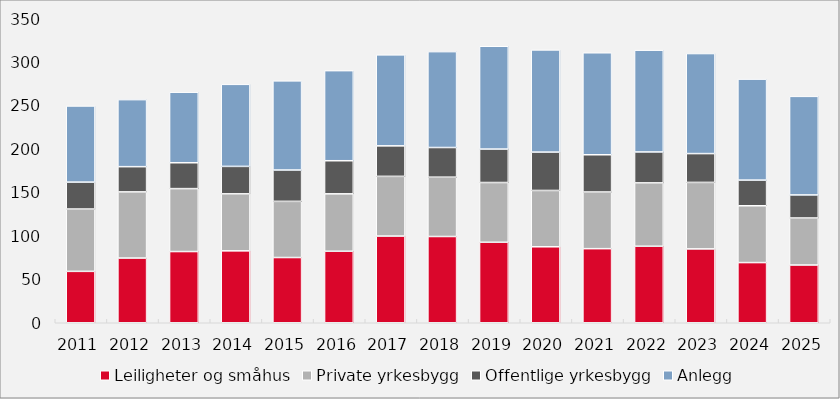
| Category | Leiligheter og småhus | Private yrkesbygg | Offentlige yrkesbygg | Anlegg |
|---|---|---|---|---|
| 2011.0 | 59.183 | 71.759 | 30.989 | 87.667 |
| 2012.0 | 74.498 | 76.179 | 29.035 | 77.186 |
| 2013.0 | 81.981 | 72.455 | 29.788 | 81.213 |
| 2014.0 | 82.78 | 65.637 | 31.603 | 94.468 |
| 2015.0 | 75.105 | 64.666 | 36.085 | 102.622 |
| 2016.0 | 82.33 | 66.102 | 38.104 | 103.724 |
| 2017.0 | 99.813 | 68.746 | 35.13 | 104.734 |
| 2018.0 | 99.308 | 68.301 | 34.145 | 110.402 |
| 2019.0 | 92.667 | 68.803 | 38.513 | 118.344 |
| 2020.0 | 87.471 | 64.843 | 44.169 | 117.629 |
| 2021.0 | 85.303 | 65.245 | 42.861 | 117.435 |
| 2022.0 | 88.103 | 72.941 | 35.602 | 117.174 |
| 2023.0 | 85.051 | 76.535 | 33.171 | 115.183 |
| 2024.0 | 69.289 | 65.415 | 29.539 | 116.256 |
| 2025.0 | 66.497 | 54.105 | 26.554 | 113.498 |